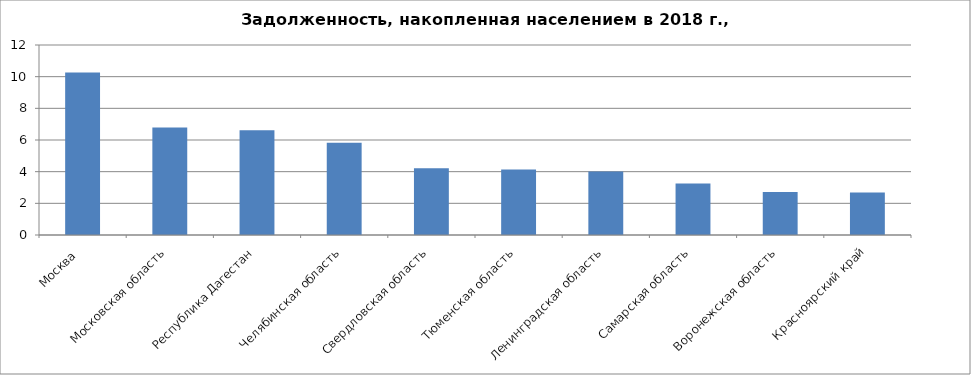
| Category | Задолженность, накопленная в 2018 г.  |
|---|---|
| Москва  | 10.259 |
| Московская область | 6.795 |
| Республика Дагестан | 6.619 |
| Челябинская область | 5.828 |
| Свердловская область | 4.218 |
| Тюменская область | 4.134 |
| Ленинградская область | 4.006 |
| Самарская область | 3.25 |
| Воронежская область | 2.713 |
| Красноярский край | 2.684 |